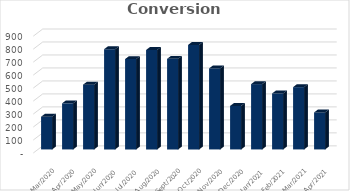
| Category | Conversions |
|---|---|
| 2021-04-30 | 285 |
| 2021-03-31 | 480 |
| 2021-02-28 | 431 |
| 2021-01-31 | 503 |
| 2020-12-31 | 335 |
| 2020-11-30 | 624 |
| 2020-10-31 | 805 |
| 2020-09-30 | 698 |
| 2020-08-31 | 766 |
| 2020-07-31 | 696 |
| 2020-06-30 | 772 |
| 2020-05-31 | 499 |
| 2020-04-30 | 355 |
| 2020-03-31 | 252 |